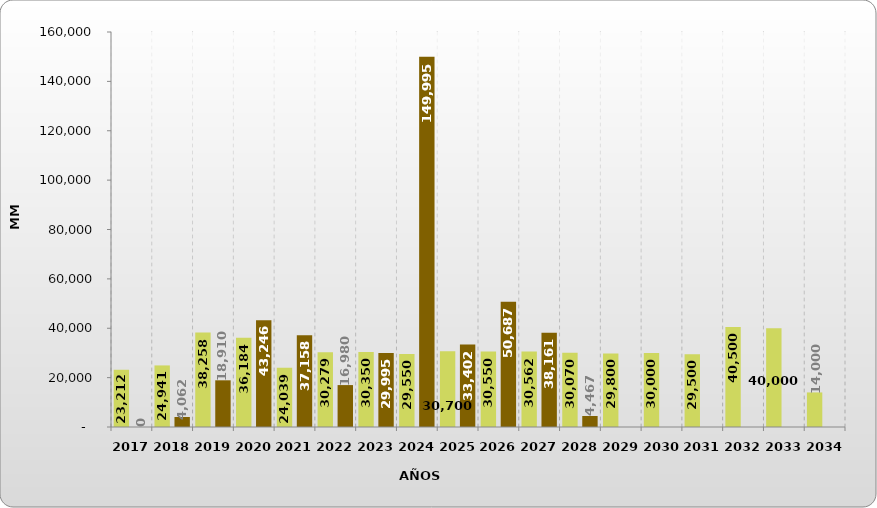
| Category | Internal Direct Debt | Internal Indirect Debt |
|---|---|---|
| 2017.0 | 23212.48 | 0 |
| 2018.0 | 24941.231 | 4062.481 |
| 2019.0 | 38257.991 | 18909.974 |
| 2020.0 | 36184.293 | 43246.154 |
| 2021.0 | 24038.607 | 37158.29 |
| 2022.0 | 30278.959 | 16979.963 |
| 2023.0 | 30350 | 29995.256 |
| 2024.0 | 29550 | 149995.256 |
| 2025.0 | 30700 | 33401.892 |
| 2026.0 | 30550 | 50686.549 |
| 2027.0 | 30561.643 | 38160.84 |
| 2028.0 | 30070.329 | 4467.091 |
| 2029.0 | 29800 | 0 |
| 2030.0 | 30000 | 0 |
| 2031.0 | 29500 | 0 |
| 2032.0 | 40500 | 0 |
| 2033.0 | 40000 | 0 |
| 2034.0 | 14000 | 0 |